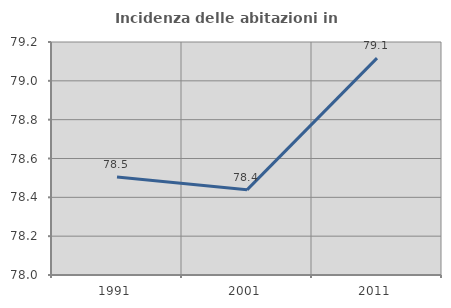
| Category | Incidenza delle abitazioni in proprietà  |
|---|---|
| 1991.0 | 78.505 |
| 2001.0 | 78.439 |
| 2011.0 | 79.117 |